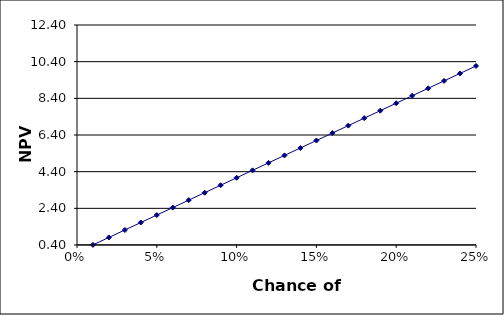
| Category | NPV ratio |
|---|---|
| 0.01 | 0.407 |
| 0.02 | 0.813 |
| 0.03 | 1.22 |
| 0.04 | 1.626 |
| 0.05 | 2.033 |
| 0.06 | 2.44 |
| 0.07 | 2.846 |
| 0.08 | 3.253 |
| 0.09 | 3.659 |
| 0.1 | 4.066 |
| 0.11 | 4.473 |
| 0.12 | 4.879 |
| 0.13 | 5.286 |
| 0.14 | 5.692 |
| 0.15 | 6.099 |
| 0.16 | 6.506 |
| 0.17 | 6.912 |
| 0.18 | 7.319 |
| 0.19 | 7.725 |
| 0.2 | 8.132 |
| 0.21 | 8.539 |
| 0.22 | 8.945 |
| 0.23 | 9.352 |
| 0.24 | 9.758 |
| 0.25 | 10.165 |